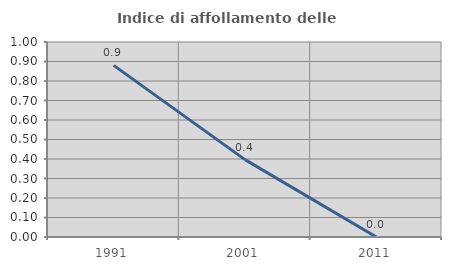
| Category | Indice di affollamento delle abitazioni  |
|---|---|
| 1991.0 | 0.88 |
| 2001.0 | 0.397 |
| 2011.0 | 0 |